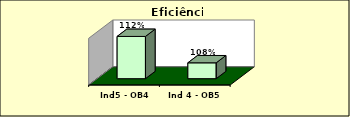
| Category | Series 0 |
|---|---|
| Ind5 - OB4 | 1.122 |
| Ind 4 - OB5 | 1.077 |